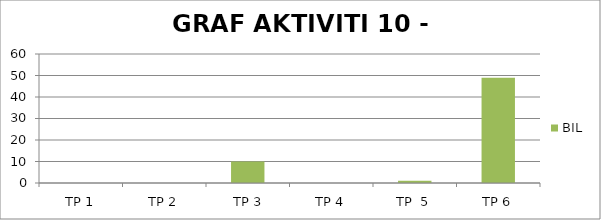
| Category | BIL |
|---|---|
| TP 1 | 0 |
| TP 2 | 0 |
|  TP 3 | 10 |
| TP 4 | 0 |
| TP  5 | 1 |
| TP 6 | 49 |